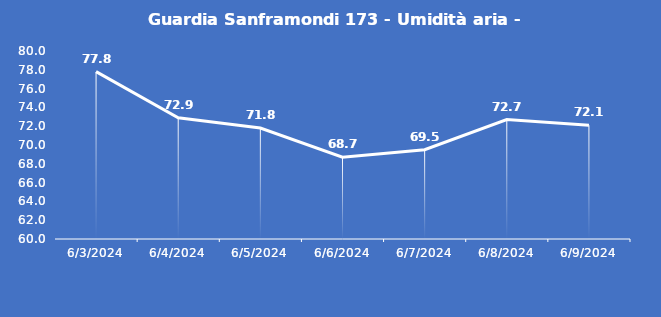
| Category | Guardia Sanframondi 173 - Umidità aria - Grezzo (%) |
|---|---|
| 6/3/24 | 77.8 |
| 6/4/24 | 72.9 |
| 6/5/24 | 71.8 |
| 6/6/24 | 68.7 |
| 6/7/24 | 69.5 |
| 6/8/24 | 72.7 |
| 6/9/24 | 72.1 |